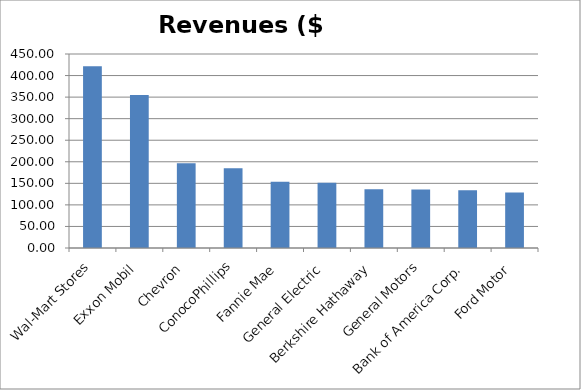
| Category | Revenues ($ billions) |
|---|---|
| Wal-Mart Stores | 421.849 |
| Exxon Mobil | 354.674 |
| Chevron | 196.337 |
| ConocoPhillips | 184.966 |
| Fannie Mae | 153.825 |
| General Electric | 151.628 |
| Berkshire Hathaway | 136.185 |
| General Motors | 135.592 |
| Bank of America Corp. | 134.194 |
| Ford Motor | 128.954 |